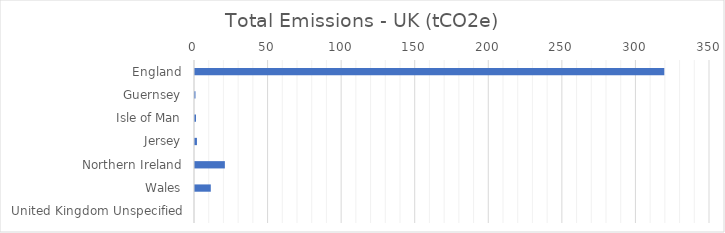
| Category | Total Emissions - UK (tCO2e) |
|---|---|
| England | 318.94 |
| Guernsey | 0.321 |
| Isle of Man | 0.679 |
| Jersey | 1.322 |
| Northern Ireland | 20.299 |
| Wales | 10.733 |
| United Kingdom Unspecified | 0 |